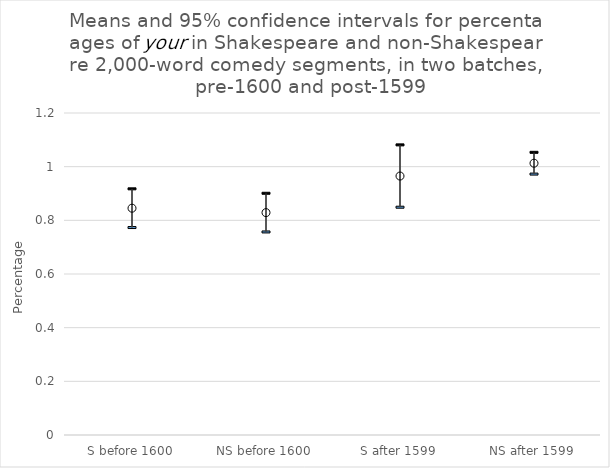
| Category | lower CL | upper CL | mean |
|---|---|---|---|
| S before 1600 | 0.773 | 0.917 | 0.845 |
| NS before 1600 | 0.757 | 0.901 | 0.829 |
| S after 1599 | 0.849 | 1.081 | 0.965 |
| NS after 1599 | 0.972 | 1.053 | 1.013 |